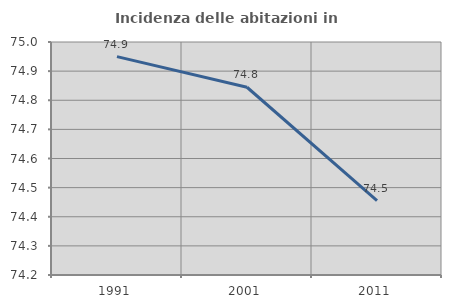
| Category | Incidenza delle abitazioni in proprietà  |
|---|---|
| 1991.0 | 74.95 |
| 2001.0 | 74.845 |
| 2011.0 | 74.456 |